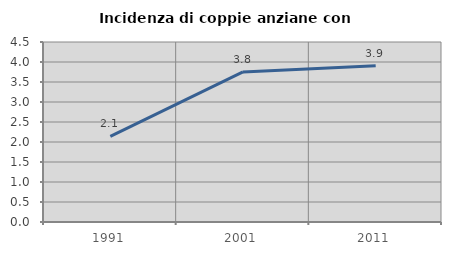
| Category | Incidenza di coppie anziane con figli |
|---|---|
| 1991.0 | 2.143 |
| 2001.0 | 3.752 |
| 2011.0 | 3.906 |